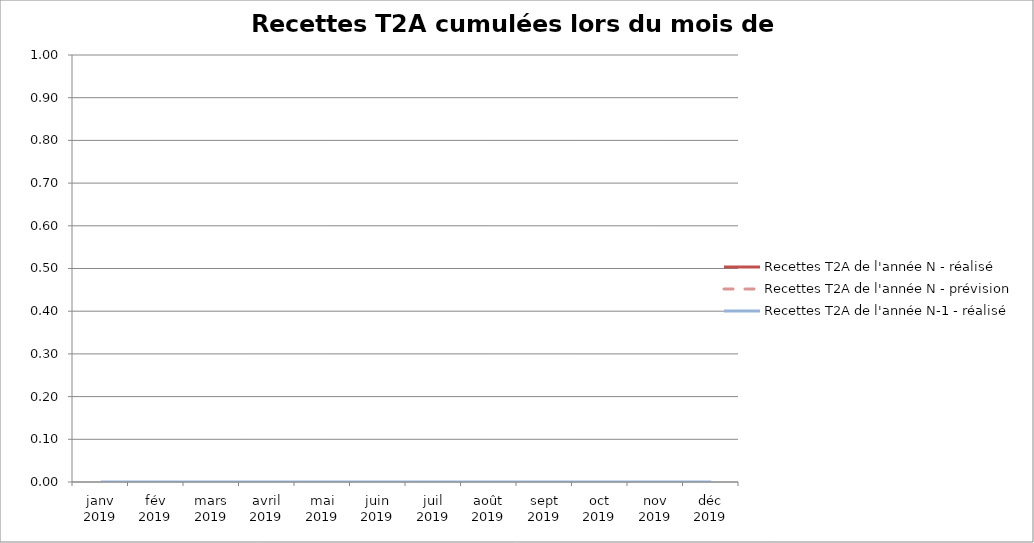
| Category | Recettes T2A de l'année N - réalisé | Recettes T2A de l'année N - prévision | Recettes T2A de l'année N-1 - réalisé |
|---|---|---|---|
| janv 2019 |  |  | 0 |
| fév 2019 |  |  | 0 |
| mars 2019 |  |  | 0 |
| avril 2019 |  |  | 0 |
| mai 2019 |  |  | 0 |
| juin 2019 |  |  | 0 |
| juil 2019 |  |  | 0 |
| août 2019 |  |  | 0 |
| sept 2019 |  |  | 0 |
| oct 2019 |  |  | 0 |
| nov 2019 |  |  | 0 |
| déc 2019 |  |  | 0 |